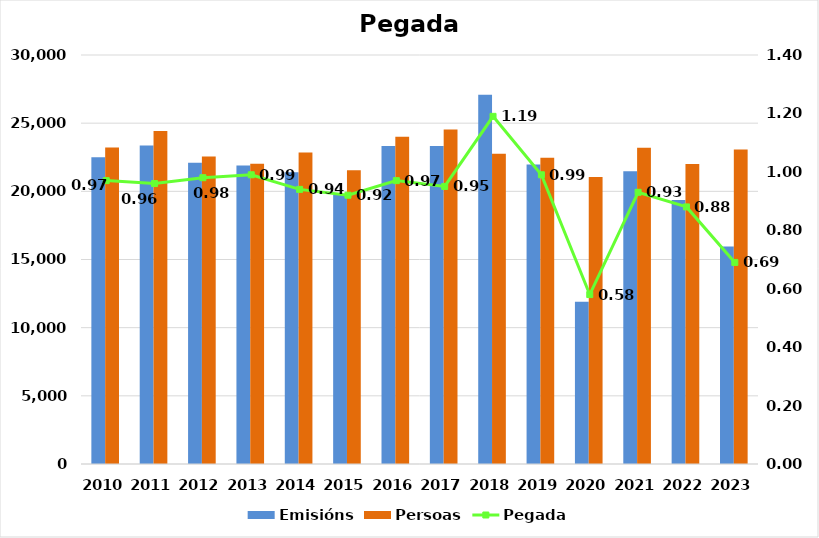
| Category | Emisións | Persoas |
|---|---|---|
| 2010.0 | 22496 | 23219 |
| 2011.0 | 23371 | 24429 |
| 2012.0 | 22096 | 22564 |
| 2013.0 | 21886 | 22026 |
| 2014.0 | 21397 | 22848 |
| 2015.0 | 19749 | 21549 |
| 2016.0 | 23330 | 24001 |
| 2017.0 | 23332 | 24529 |
| 2018.0 | 27081 | 22757 |
| 2019.0 | 21976 | 22467 |
| 2020.0 | 11903 | 21048 |
| 2021.0 | 21468 | 23204 |
| 2022.0 | 19360 | 22008 |
| 2023.0 | 15954 | 23072 |